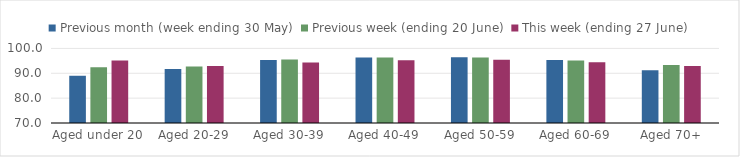
| Category | Previous month (week ending 30 May) | Previous week (ending 20 June) | This week (ending 27 June) |
|---|---|---|---|
| Aged under 20 | 89.004 | 92.378 | 95.106 |
| Aged 20-29 | 91.722 | 92.76 | 92.964 |
| Aged 30-39 | 95.35 | 95.577 | 94.32 |
| Aged 40-49 | 96.337 | 96.345 | 95.264 |
| Aged 50-59 | 96.422 | 96.381 | 95.478 |
| Aged 60-69 | 95.381 | 95.143 | 94.445 |
| Aged 70+ | 91.22 | 93.296 | 92.966 |